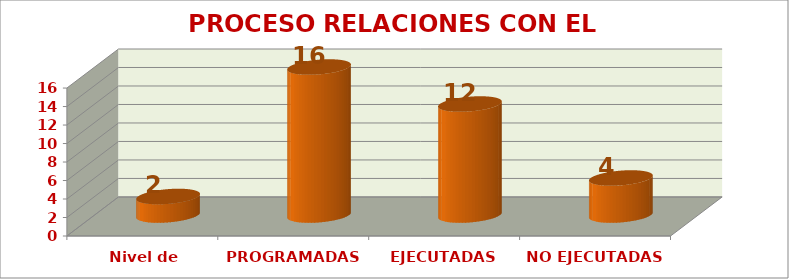
| Category | PROCESO RELACIONES CON EL ENTORNO |
|---|---|
| Nivel de satisfacción | 2 |
| PROGRAMADAS | 16 |
| EJECUTADAS | 12 |
| NO EJECUTADAS | 4 |